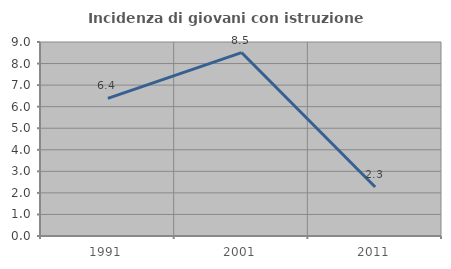
| Category | Incidenza di giovani con istruzione universitaria |
|---|---|
| 1991.0 | 6.383 |
| 2001.0 | 8.511 |
| 2011.0 | 2.273 |